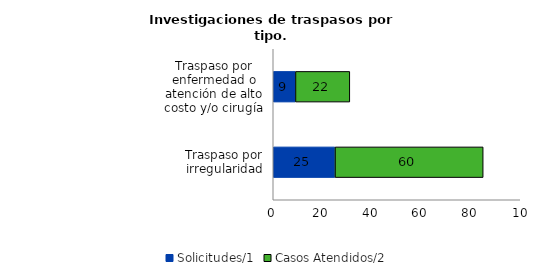
| Category |  Solicitudes/1 | Casos Atendidos/2 |
|---|---|---|
| Traspaso por enfermedad o atención de alto costo y/o cirugía | 9 | 22 |
| Traspaso por irregularidad | 25 | 60 |